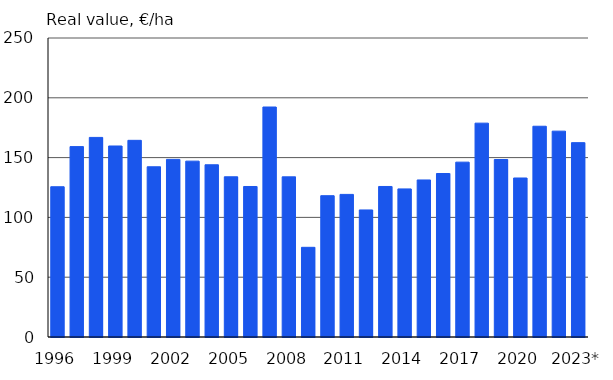
| Category | Real value, €/ha |
|---|---|
| 1996 | 125.639 |
| 1997 | 159.179 |
| 1998 | 166.88 |
| 1999 | 159.708 |
| 2000 | 164.437 |
| 2001 | 142.325 |
| 2002 | 148.513 |
| 2003 | 147.049 |
| 2004 | 144.009 |
| 2005 | 133.957 |
| 2006 | 125.841 |
| 2007 | 192.3 |
| 2008 | 133.911 |
| 2009 | 74.985 |
| 2010 | 118.144 |
| 2011 | 119.235 |
| 2012 | 106.235 |
| 2013 | 125.855 |
| 2014 | 123.816 |
| 2015 | 131.303 |
| 2016 | 136.704 |
| 2017 | 146.196 |
| 2018 | 178.8 |
| 2019 | 148.4 |
| 2020 | 132.945 |
| 2021 | 176.213 |
| 2022 | 172.12 |
| 2023* | 162.5 |